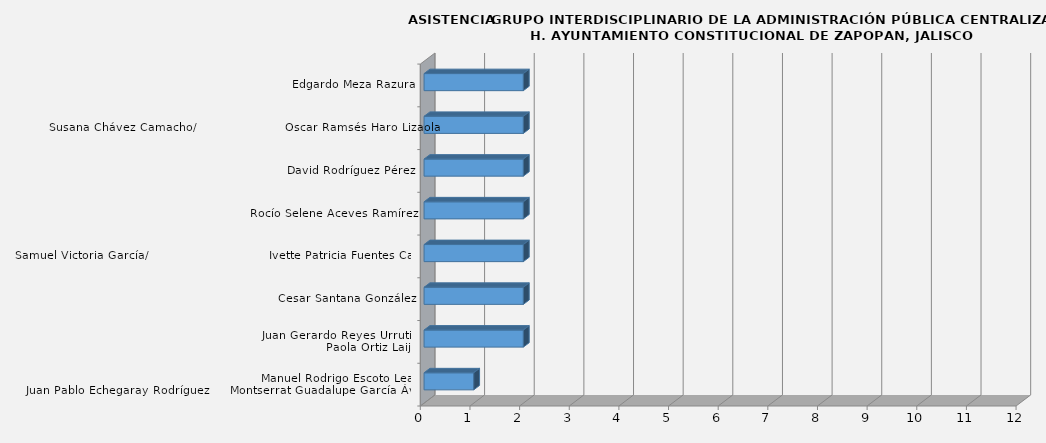
| Category | Series 0 |
|---|---|
| Manuel Rodrigo Escoto Leal/
Juan Pablo Echegaray Rodríguez     Montserrat Guadalupe García Ávalos | 1 |
| Juan Gerardo Reyes Urrutia/
Paola Ortiz Laija | 2 |
| Cesar Santana González | 2 |
| Samuel Victoria García/                              Ivette Patricia Fuentes Calvillo  | 2 |
| Rocío Selene Aceves Ramírez | 2 |
| David Rodríguez Pérez | 2 |
| Susana Chávez Camacho/                      Oscar Ramsés Haro Lizaola | 2 |
| Edgardo Meza Razura | 2 |